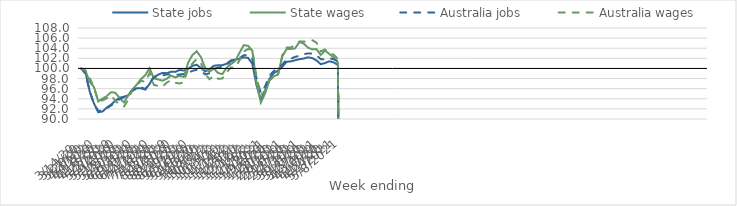
| Category | State jobs | State wages | Australia jobs | Australia wages |
|---|---|---|---|---|
| 14/03/2020 | 100 | 100 | 100 | 100 |
| 21/03/2020 | 99.321 | 99.562 | 98.971 | 99.603 |
| 28/03/2020 | 95.462 | 97.356 | 95.467 | 98.105 |
| 04/04/2020 | 93.057 | 96.323 | 92.92 | 96.234 |
| 11/04/2020 | 91.348 | 93.49 | 91.647 | 93.487 |
| 18/04/2020 | 91.48 | 94.037 | 91.63 | 93.692 |
| 25/04/2020 | 92.262 | 94.529 | 92.16 | 94.108 |
| 02/05/2020 | 92.854 | 95.329 | 92.657 | 94.655 |
| 09/05/2020 | 93.613 | 95.166 | 93.343 | 93.578 |
| 16/05/2020 | 94.224 | 94.143 | 93.935 | 92.812 |
| 23/05/2020 | 94.407 | 93.267 | 94.291 | 92.462 |
| 30/05/2020 | 94.686 | 94.668 | 94.798 | 93.79 |
| 06/06/2020 | 95.54 | 95.816 | 95.781 | 95.926 |
| 13/06/2020 | 96.093 | 96.823 | 96.28 | 96.602 |
| 20/06/2020 | 96.07 | 97.908 | 96.296 | 97.58 |
| 27/06/2020 | 95.82 | 98.673 | 95.902 | 97.326 |
| 04/07/2020 | 96.946 | 100.052 | 97.157 | 99.113 |
| 11/07/2020 | 98.291 | 98.037 | 98.279 | 96.733 |
| 18/07/2020 | 98.766 | 97.829 | 98.382 | 96.561 |
| 25/07/2020 | 99.118 | 97.577 | 98.604 | 96.362 |
| 01/08/2020 | 99.064 | 97.961 | 98.826 | 97.197 |
| 08/08/2020 | 99.35 | 98.574 | 98.822 | 97.652 |
| 15/08/2020 | 99.319 | 98.231 | 98.73 | 97.16 |
| 22/08/2020 | 99.693 | 98.529 | 98.792 | 97.027 |
| 29/08/2020 | 99.596 | 98.31 | 98.928 | 97.246 |
| 05/09/2020 | 99.921 | 101.117 | 99.113 | 99.964 |
| 12/09/2020 | 100.518 | 102.646 | 99.531 | 100.967 |
| 19/09/2020 | 100.735 | 103.409 | 99.714 | 101.852 |
| 26/09/2020 | 100.08 | 102.238 | 99.52 | 101.02 |
| 03/10/2020 | 99.396 | 100.045 | 98.806 | 98.883 |
| 10/10/2020 | 99.861 | 99.349 | 99.055 | 97.873 |
| 17/10/2020 | 100.525 | 99.986 | 99.899 | 98.568 |
| 24/10/2020 | 100.629 | 99.099 | 100.18 | 97.964 |
| 31/10/2020 | 100.645 | 98.875 | 100.306 | 97.998 |
| 07/11/2020 | 100.933 | 100.147 | 100.68 | 99.252 |
| 14/11/2020 | 101.591 | 100.85 | 101.424 | 100.173 |
| 21/11/2020 | 101.747 | 101.462 | 101.745 | 100.229 |
| 28/11/2020 | 101.881 | 103.087 | 102.059 | 101.576 |
| 05/12/2020 | 102.204 | 104.588 | 102.608 | 103.362 |
| 12/12/2020 | 102.092 | 104.492 | 102.679 | 103.837 |
| 19/12/2020 | 100.957 | 103.543 | 101.871 | 103.708 |
| 26/12/2020 | 96.615 | 97.117 | 98.073 | 98.239 |
| 02/01/2021 | 93.742 | 93.258 | 95.142 | 94.651 |
| 09/01/2021 | 95.569 | 95.057 | 96.464 | 95.644 |
| 16/01/2021 | 97.926 | 97.61 | 98.546 | 97.678 |
| 23/01/2021 | 99.075 | 98.44 | 99.493 | 98.293 |
| 30/01/2021 | 99.559 | 98.77 | 99.995 | 98.662 |
| 06/02/2021 | 100.325 | 102.356 | 100.749 | 102.61 |
| 13/02/2021 | 101.316 | 103.836 | 101.78 | 104.166 |
| 20/02/2021 | 101.395 | 103.847 | 101.937 | 104.163 |
| 27/02/2021 | 101.615 | 103.97 | 102.282 | 104.593 |
| 06/03/2021 | 101.824 | 105.232 | 102.496 | 105.335 |
| 13/03/2021 | 101.953 | 104.922 | 102.825 | 105.317 |
| 20/03/2021 | 102.201 | 104.116 | 102.964 | 105.281 |
| 27/03/2021 | 102.055 | 103.772 | 102.951 | 105.588 |
| 03/04/2021 | 101.589 | 103.826 | 102.614 | 105.117 |
| 10/04/2021 | 100.838 | 102.656 | 101.84 | 103.377 |
| 17/04/2021 | 101.067 | 103.553 | 101.797 | 103.762 |
| 24/04/2021 | 101.414 | 102.863 | 102 | 103.175 |
| 01/05/2021 | 101.207 | 102.178 | 101.825 | 102.713 |
| 08/05/2021 | 100.683 | 101.139 | 101.453 | 101.885 |